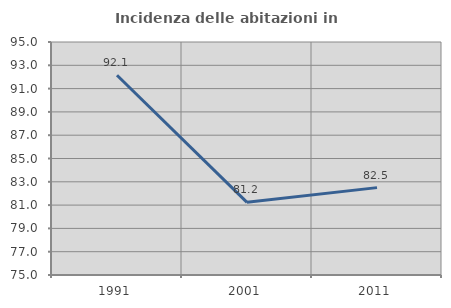
| Category | Incidenza delle abitazioni in proprietà  |
|---|---|
| 1991.0 | 92.145 |
| 2001.0 | 81.235 |
| 2011.0 | 82.5 |